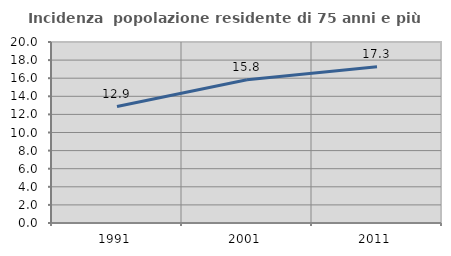
| Category | Incidenza  popolazione residente di 75 anni e più |
|---|---|
| 1991.0 | 12.868 |
| 2001.0 | 15.83 |
| 2011.0 | 17.254 |